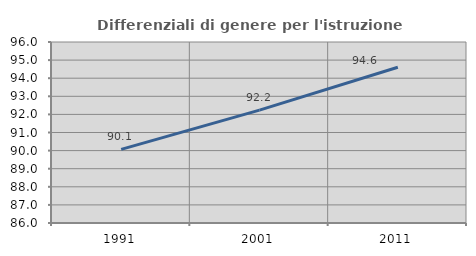
| Category | Differenziali di genere per l'istruzione superiore |
|---|---|
| 1991.0 | 90.069 |
| 2001.0 | 92.239 |
| 2011.0 | 94.608 |